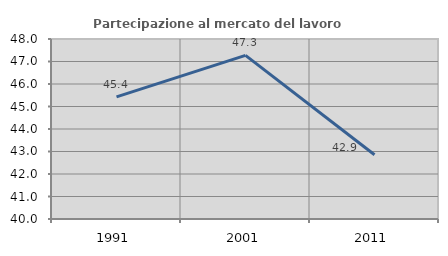
| Category | Partecipazione al mercato del lavoro  femminile |
|---|---|
| 1991.0 | 45.43 |
| 2001.0 | 47.274 |
| 2011.0 | 42.857 |